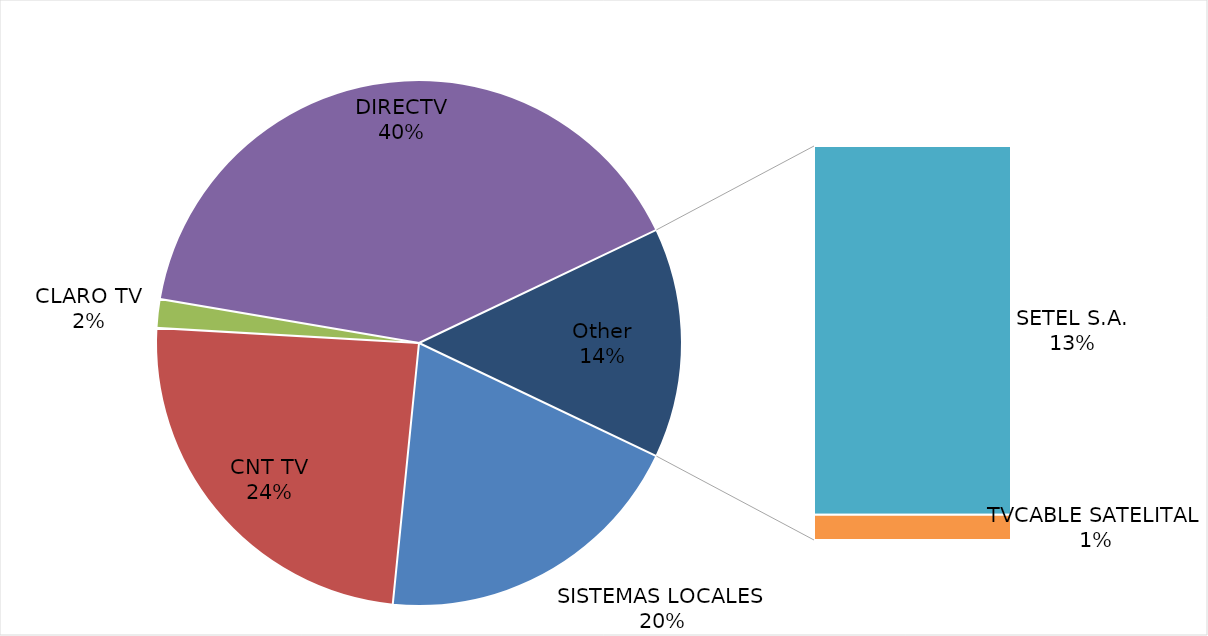
| Category | Series 0 | Series 1 |
|---|---|---|
| SISTEMAS LOCALES | 167179.521 | 0.195 |
| CNT TV | 208329 | 0.243 |
| CLARO TV | 15111 | 0.018 |
| DIRECTV | 344742 | 0.402 |
| SETEL S.A. | 113437 | 0.132 |
| TVCABLE SATELITAL | 7797 | 0.009 |